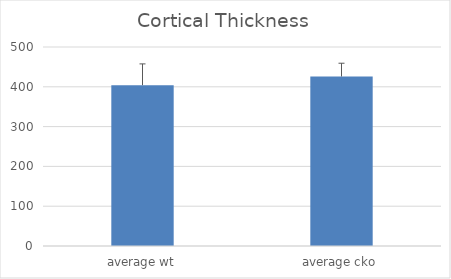
| Category | Series 0 |
|---|---|
| average wt | 404.028 |
| average cko | 425.886 |